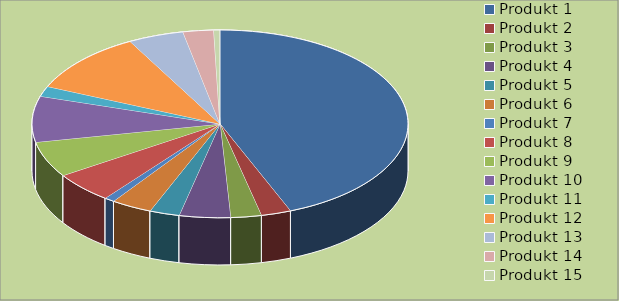
| Category | Series 0 |
|---|---|
| Produkt 1 | 5000 |
| Produkt 2 | 294 |
| Produkt 3 | 300 |
| Produkt 4 | 500 |
| Produkt 5 | 294 |
| Produkt 6 | 400 |
| Produkt 7 | 100 |
| Produkt 8 | 600 |
| Produkt 9 | 700 |
| Produkt 10 | 900 |
| Produkt 11 | 200 |
| Produkt 12 | 1200 |
| Produkt 13 | 544 |
| Produkt 14 | 300 |
| Produkt 15 | 60 |